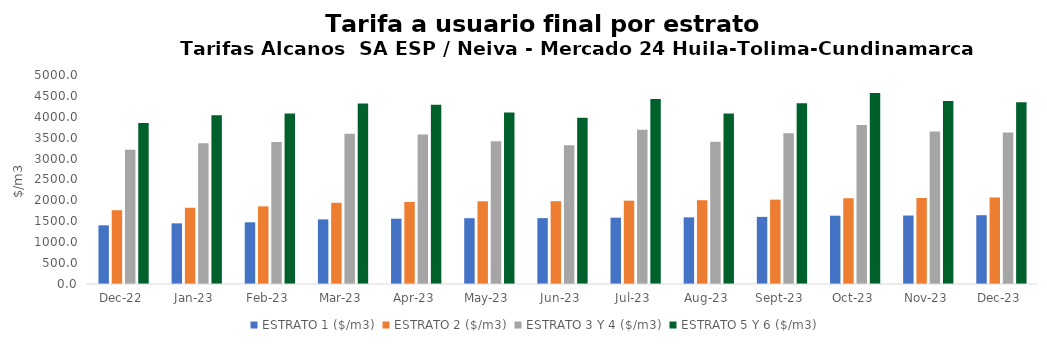
| Category | ESTRATO 1 ($/m3) | ESTRATO 2 ($/m3) | ESTRATO 3 Y 4 ($/m3) | ESTRATO 5 Y 6 ($/m3) |
|---|---|---|---|---|
| 2022-12-01 | 1403.94 | 1765.16 | 3209.93 | 3851.916 |
| 2023-01-01 | 1450.9 | 1824.58 | 3365.49 | 4038.588 |
| 2023-02-01 | 1476.55 | 1857.05 | 3398.26 | 4077.912 |
| 2023-03-01 | 1545.84 | 1943.33 | 3596.1 | 4315.32 |
| 2023-04-01 | 1562.23 | 1963.79 | 3575.22 | 4290.264 |
| 2023-05-01 | 1574.25 | 1979.21 | 3416.65 | 4099.98 |
| 2023-06-01 | 1575.71 | 1980.83 | 3316.57 | 3979.884 |
| 2023-07-01 | 1586.9 | 1994.23 | 3689.81 | 4427.772 |
| 2023-08-01 | 1594.84 | 2004.4 | 3401.48 | 4081.776 |
| 2023-09-01 | 1606 | 2018.25 | 3603.59 | 4324.308 |
| 2023-10-01 | 1634.07 | 2053.24 | 3805.44 | 4566.528 |
| 2023-11-01 | 1638.05 | 2058.35 | 3648.51 | 4378.212 |
| 2023-12-01 | 1645.74 | 2067.85 | 3624.28 | 4349.136 |